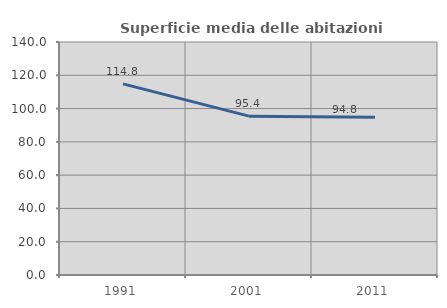
| Category | Superficie media delle abitazioni occupate |
|---|---|
| 1991.0 | 114.833 |
| 2001.0 | 95.434 |
| 2011.0 | 94.772 |